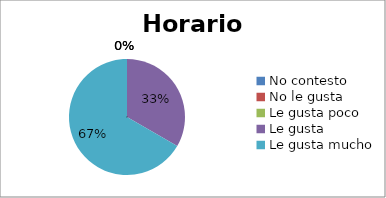
| Category | Series 0 |
|---|---|
| No contesto | 0 |
| No le gusta | 0 |
| Le gusta poco | 0 |
| Le gusta | 2 |
| Le gusta mucho | 4 |